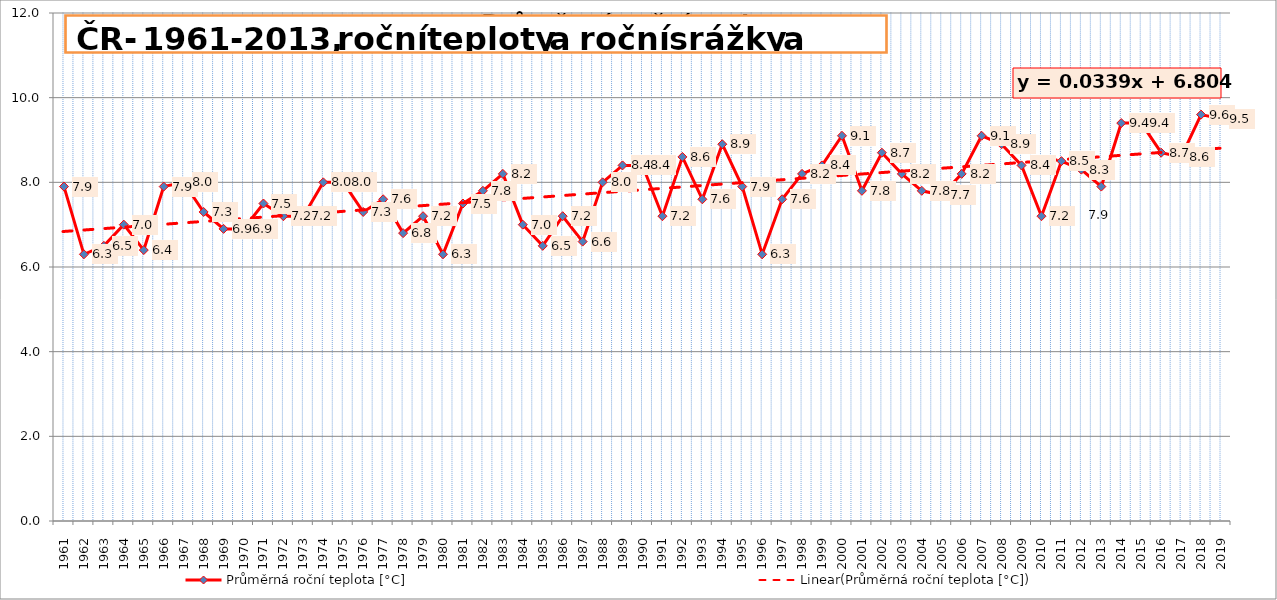
| Category | Průměrná roční teplota [°C] |
|---|---|
| 1961.0 | 7.9 |
| 1962.0 | 6.3 |
| 1963.0 | 6.5 |
| 1964.0 | 7 |
| 1965.0 | 6.4 |
| 1966.0 | 7.9 |
| 1967.0 | 8 |
| 1968.0 | 7.3 |
| 1969.0 | 6.9 |
| 1970.0 | 6.9 |
| 1971.0 | 7.5 |
| 1972.0 | 7.2 |
| 1973.0 | 7.2 |
| 1974.0 | 8 |
| 1975.0 | 8 |
| 1976.0 | 7.3 |
| 1977.0 | 7.6 |
| 1978.0 | 6.8 |
| 1979.0 | 7.2 |
| 1980.0 | 6.3 |
| 1981.0 | 7.5 |
| 1982.0 | 7.8 |
| 1983.0 | 8.2 |
| 1984.0 | 7 |
| 1985.0 | 6.5 |
| 1986.0 | 7.2 |
| 1987.0 | 6.6 |
| 1988.0 | 8 |
| 1989.0 | 8.4 |
| 1990.0 | 8.4 |
| 1991.0 | 7.2 |
| 1992.0 | 8.6 |
| 1993.0 | 7.6 |
| 1994.0 | 8.9 |
| 1995.0 | 7.9 |
| 1996.0 | 6.3 |
| 1997.0 | 7.6 |
| 1998.0 | 8.2 |
| 1999.0 | 8.4 |
| 2000.0 | 9.1 |
| 2001.0 | 7.8 |
| 2002.0 | 8.7 |
| 2003.0 | 8.2 |
| 2004.0 | 7.8 |
| 2005.0 | 7.7 |
| 2006.0 | 8.2 |
| 2007.0 | 9.1 |
| 2008.0 | 8.9 |
| 2009.0 | 8.4 |
| 2010.0 | 7.2 |
| 2011.0 | 8.5 |
| 2012.0 | 8.3 |
| 2013.0 | 7.9 |
| 2014.0 | 9.4 |
| 2015.0 | 9.4 |
| 2016.0 | 8.7 |
| 2017.0 | 8.6 |
| 2018.0 | 9.6 |
| 2019.0 | 9.5 |